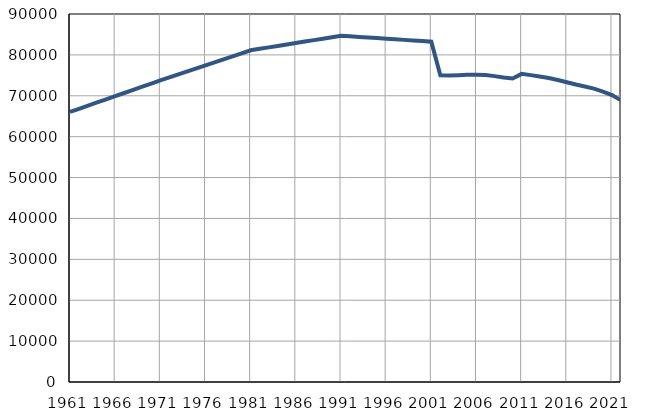
| Category | Population
size |
|---|---|
| 1961.0 | 66047 |
| 1962.0 | 66819 |
| 1963.0 | 67591 |
| 1964.0 | 68363 |
| 1965.0 | 69135 |
| 1966.0 | 69908 |
| 1967.0 | 70680 |
| 1968.0 | 71452 |
| 1969.0 | 72224 |
| 1970.0 | 72996 |
| 1971.0 | 73768 |
| 1972.0 | 74504 |
| 1973.0 | 75239 |
| 1974.0 | 75975 |
| 1975.0 | 76710 |
| 1976.0 | 77446 |
| 1977.0 | 78181 |
| 1978.0 | 78917 |
| 1979.0 | 79652 |
| 1980.0 | 80388 |
| 1981.0 | 81123 |
| 1982.0 | 81479 |
| 1983.0 | 81834 |
| 1984.0 | 82190 |
| 1985.0 | 82545 |
| 1986.0 | 82901 |
| 1987.0 | 83256 |
| 1988.0 | 83612 |
| 1989.0 | 83967 |
| 1990.0 | 84323 |
| 1991.0 | 84678 |
| 1992.0 | 84534 |
| 1993.0 | 84391 |
| 1994.0 | 84247 |
| 1995.0 | 84103 |
| 1996.0 | 83960 |
| 1997.0 | 83816 |
| 1998.0 | 83672 |
| 1999.0 | 83528 |
| 2000.0 | 83384 |
| 2001.0 | 83241 |
| 2002.0 | 74994 |
| 2003.0 | 74937 |
| 2004.0 | 75021 |
| 2005.0 | 75126 |
| 2006.0 | 75118 |
| 2007.0 | 75059 |
| 2008.0 | 74805 |
| 2009.0 | 74463 |
| 2010.0 | 74225 |
| 2011.0 | 75362 |
| 2012.0 | 75054 |
| 2013.0 | 74713 |
| 2014.0 | 74328 |
| 2015.0 | 73861 |
| 2016.0 | 73320 |
| 2017.0 | 72768 |
| 2018.0 | 72272 |
| 2019.0 | 71746 |
| 2020.0 | 71026 |
| 2021.0 | 70168 |
| 2022.0 | 68871 |